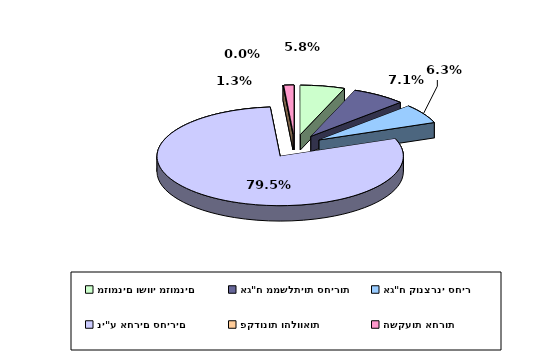
| Category | Series 0 |
|---|---|
| מזומנים ושווי מזומנים | 0.058 |
| אג"ח ממשלתיות סחירות | 0.071 |
| אג"ח קונצרני סחיר | 0.063 |
| ני"ע אחרים סחירים | 0.795 |
| פקדונות והלוואות | 0 |
| השקעות אחרות | 0.013 |